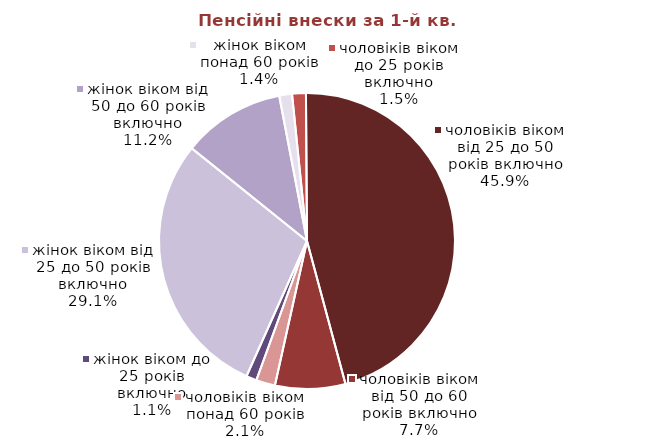
| Category | Series 0 |
|---|---|
| жінок віком до 25 років включно | 550637.68 |
| жінок віком від 25 до 50 років включно | 14007345.74 |
| жінок віком від 50 до 60 років включно | 5398717.58 |
| жінок віком понад 60 років | 672334.32 |
| чоловіків віком до 25 років включно | 724656.09 |
| чоловіків віком від 25 до 50 років включно | 22121923.81 |
| чоловіків віком від 50 до 60 років включно | 3693720.85 |
| чоловіків віком понад 60 років | 998767.54 |